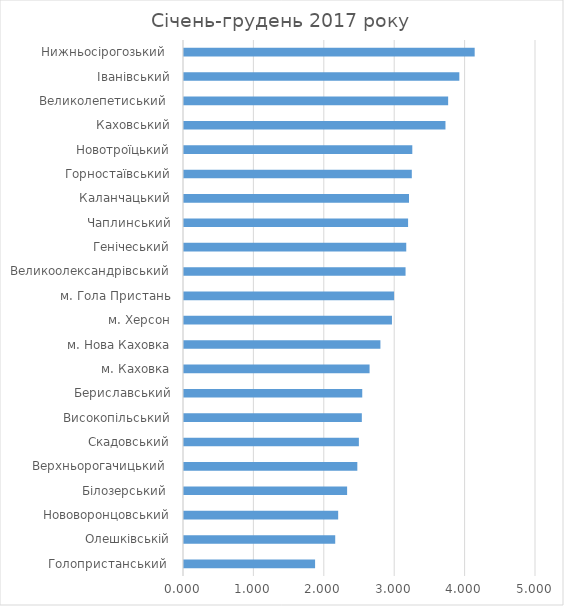
| Category | Series 0 |
|---|---|
| Голопристанський  | 1.862 |
| Олешківській | 2.148 |
| Нововоронцовський | 2.19 |
| Білозерський  | 2.317 |
| Верхньорогачицький  | 2.462 |
| Скадовський | 2.484 |
| Високопільський | 2.526 |
| Бериславський | 2.532 |
| м. Каховка | 2.636 |
| м. Нова Каховка | 2.79 |
| м. Херсон | 2.954 |
| м. Гола Пристань | 2.984 |
| Великоолександрівський | 3.147 |
| Генічеський | 3.157 |
| Чаплинський | 3.183 |
| Каланчацький | 3.196 |
| Горностаївський | 3.236 |
| Новотроїцький | 3.243 |
| Каховський | 3.714 |
| Великолепетиський  | 3.752 |
| Іванівський | 3.911 |
| Нижньосірогозький  | 4.129 |